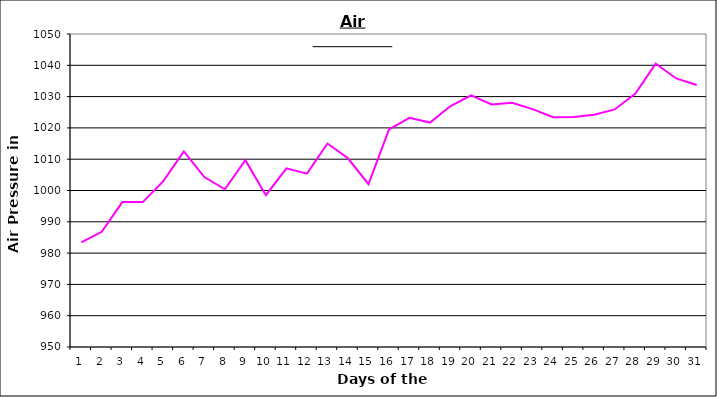
| Category | Series 0 |
|---|---|
| 0 | 983.4 |
| 1 | 986.8 |
| 2 | 996.3 |
| 3 | 996.3 |
| 4 | 1003 |
| 5 | 1012.5 |
| 6 | 1004.3 |
| 7 | 1000.4 |
| 8 | 1009.7 |
| 9 | 998.5 |
| 10 | 1007.1 |
| 11 | 1005.4 |
| 12 | 1015 |
| 13 | 1010.3 |
| 14 | 1002 |
| 15 | 1019.5 |
| 16 | 1023.2 |
| 17 | 1021.7 |
| 18 | 1027 |
| 19 | 1030.4 |
| 20 | 1027.5 |
| 21 | 1028 |
| 22 | 1026 |
| 23 | 1023.4 |
| 24 | 1023.5 |
| 25 | 1024.2 |
| 26 | 1025.9 |
| 27 | 1030.9 |
| 28 | 1040.5 |
| 29 | 1035.8 |
| 30 | 1033.7 |